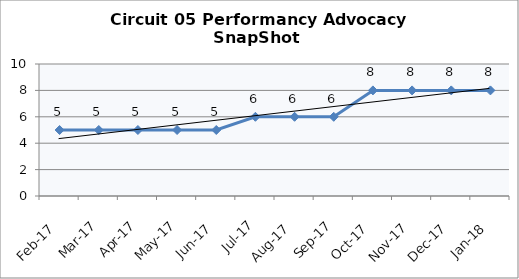
| Category | Circuit 05 |
|---|---|
| Feb-17 | 5 |
| Mar-17 | 5 |
| Apr-17 | 5 |
| May-17 | 5 |
| Jun-17 | 5 |
| Jul-17 | 6 |
| Aug-17 | 6 |
| Sep-17 | 6 |
| Oct-17 | 8 |
| Nov-17 | 8 |
| Dec-17 | 8 |
| Jan-18 | 8 |